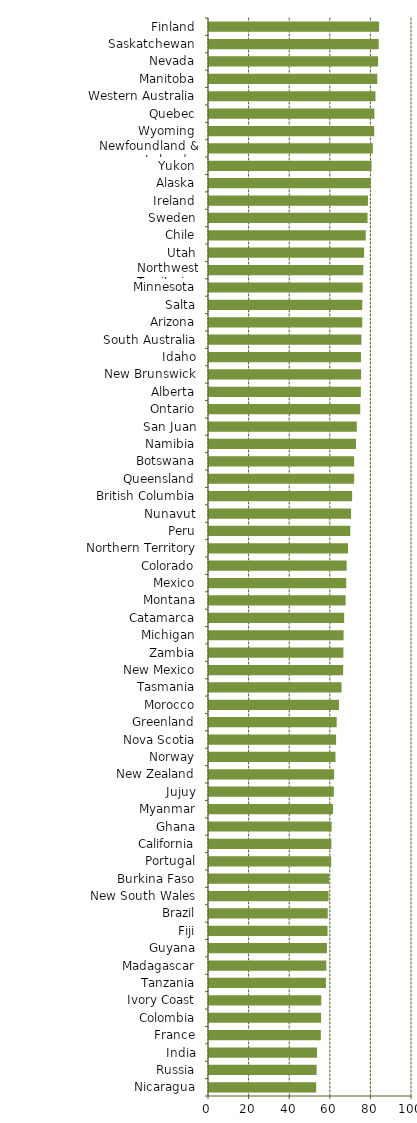
| Category | Series 0 |
|---|---|
| Nicaragua | 52.8 |
| Russia | 53 |
| India | 53.2 |
| France | 55.1 |
| Colombia | 55.2 |
| Ivory Coast | 55.3 |
| Tanzania | 57.6 |
| Madagascar | 57.8 |
| Guyana | 58.1 |
| Fiji | 58.4 |
| Brazil | 58.5 |
| New South Wales | 58.9 |
| Burkina Faso | 59.1 |
| Portugal | 60.2 |
| California | 60.3 |
| Ghana | 60.4 |
| Myanmar | 61.1 |
| Jujuy | 61.5 |
| New Zealand | 61.6 |
| Norway | 62.3 |
| Nova Scotia | 62.6 |
| Greenland | 62.9 |
| Morocco | 64 |
| Tasmania | 65.3 |
| New Mexico | 66.1 |
| Zambia | 66.2 |
| Michigan | 66.3 |
| Catamarca | 66.6 |
| Montana | 67.3 |
| Mexico | 67.6 |
| Colorado | 67.8 |
| Northern Territory | 68.5 |
| Peru | 69.6 |
| Nunavut | 70 |
| British Columbia | 70.5 |
| Queensland | 71.5 |
| Botswana | 71.5 |
| Namibia | 72.4 |
| San Juan | 72.8 |
| Ontario | 74.5 |
| Alberta | 74.8 |
| New Brunswick | 74.9 |
| Idaho | 74.9 |
| South Australia | 75.1 |
| Arizona | 75.5 |
| Salta | 75.5 |
| Minnesota | 75.7 |
| Northwest Territories | 76 |
| Utah | 76.4 |
| Chile | 77.2 |
| Sweden | 78.1 |
| Ireland | 78.3 |
| Alaska | 79.7 |
| Yukon | 80.1 |
| Newfoundland & Labrador | 80.7 |
| Wyoming | 81.4 |
| Quebec | 81.5 |
| Western Australia | 82 |
| Manitoba | 82.9 |
| Nevada | 83.3 |
| Saskatchewan | 83.6 |
| Finland | 83.8 |